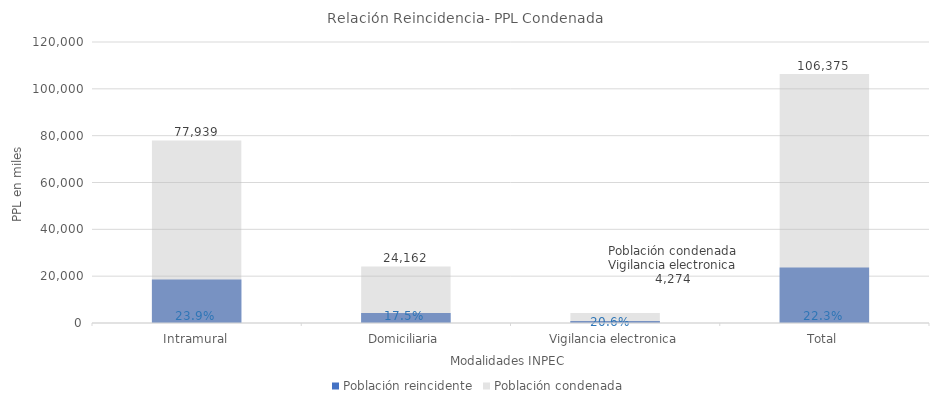
| Category | Población reincidente | Población condenada |
|---|---|---|
| Intramural | 18590 | 77939 |
| Domiciliaria | 4225 | 24162 |
| Vigilancia electronica | 881 | 4274 |
| Total | 23696 | 106375 |